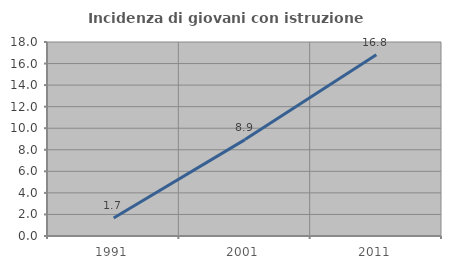
| Category | Incidenza di giovani con istruzione universitaria |
|---|---|
| 1991.0 | 1.667 |
| 2001.0 | 8.943 |
| 2011.0 | 16.822 |